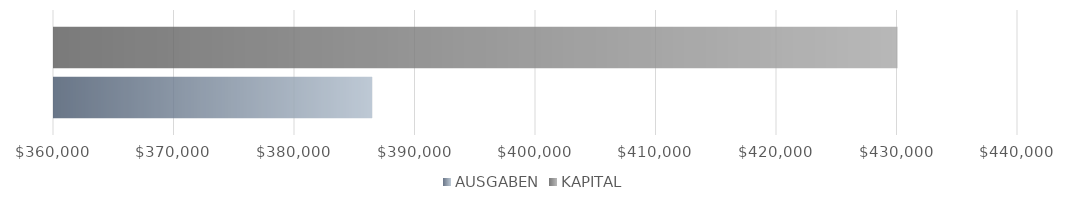
| Category | AUSGABEN | KAPITAL |
|---|---|---|
| 0 | 386400 | 430000 |